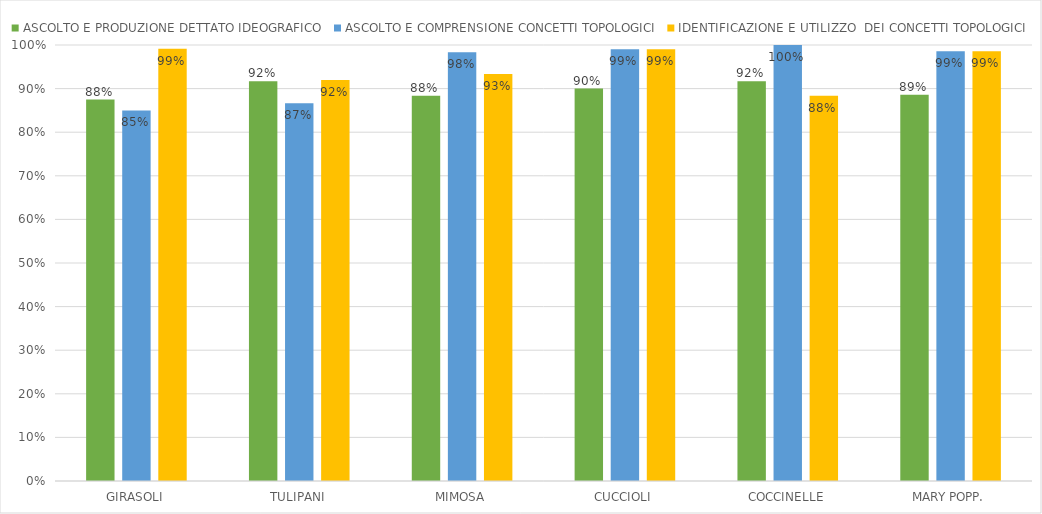
| Category | ASCOLTO E PRODUZIONE DETTATO IDEOGRAFICO | ASCOLTO E COMPRENSIONE CONCETTI TOPOLOGICI | IDENTIFICAZIONE E UTILIZZO  DEI CONCETTI TOPOLOGICI |
|---|---|---|---|
| GIRASOLI | 0.875 | 0.85 | 0.992 |
| TULIPANI | 0.917 | 0.867 | 0.92 |
| MIMOSA | 0.883 | 0.983 | 0.933 |
| CUCCIOLI | 0.9 | 0.99 | 0.99 |
| COCCINELLE | 0.917 | 1 | 0.883 |
| MARY POPP. | 0.886 | 0.986 | 0.986 |